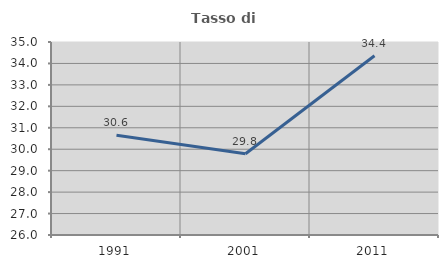
| Category | Tasso di occupazione   |
|---|---|
| 1991.0 | 30.649 |
| 2001.0 | 29.787 |
| 2011.0 | 34.362 |